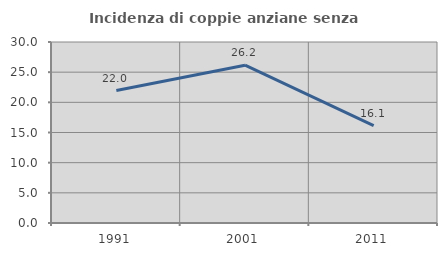
| Category | Incidenza di coppie anziane senza figli  |
|---|---|
| 1991.0 | 21.951 |
| 2001.0 | 26.154 |
| 2011.0 | 16.129 |